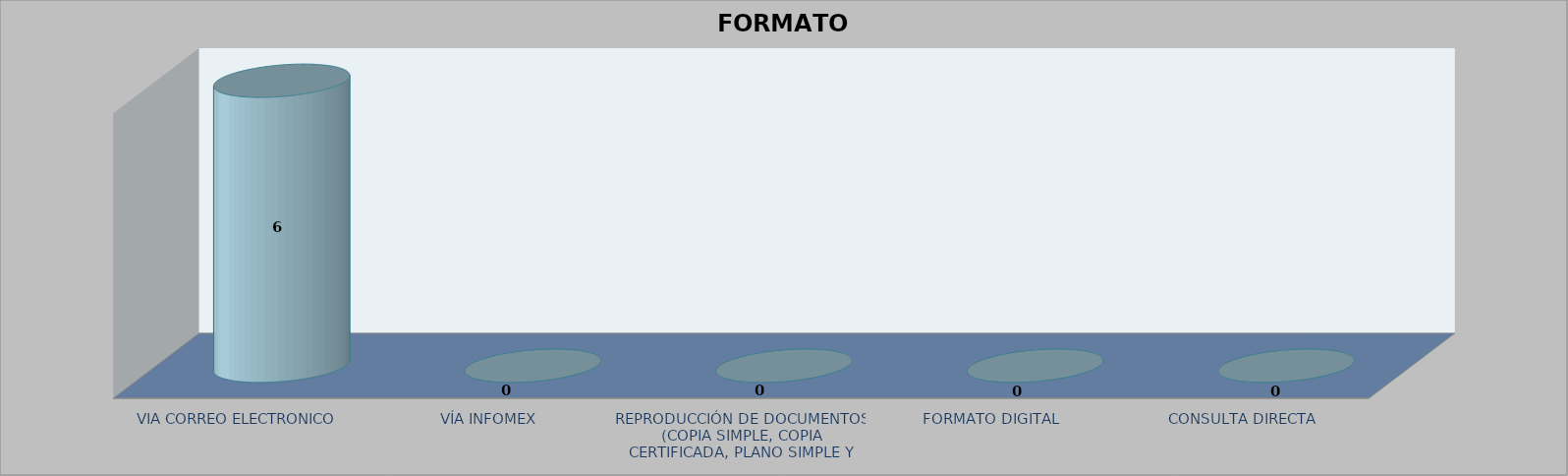
| Category |        FORMATO SOLICITADO | Series 1 | Series 2 |
|---|---|---|---|
| VIA CORREO ELECTRONICO |  |  | 6 |
| VÍA INFOMEX |  |  | 0 |
| REPRODUCCIÓN DE DOCUMENTOS (COPIA SIMPLE, COPIA CERTIFICADA, PLANO SIMPLE Y PLANO CERTIFICADO) |  |  | 0 |
| FORMATO DIGITAL |  |  | 0 |
| CONSULTA DIRECTA |  |  | 0 |